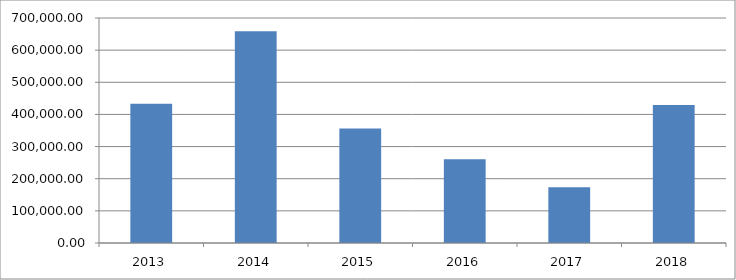
| Category | Series 0 |
|---|---|
| 2013.0 | 433211.104 |
| 2014.0 | 658478.034 |
| 2015.0 | 355853.463 |
| 2016.0 | 260877.623 |
| 2017.0 | 173355.014 |
| 2018.0 | 429524.669 |